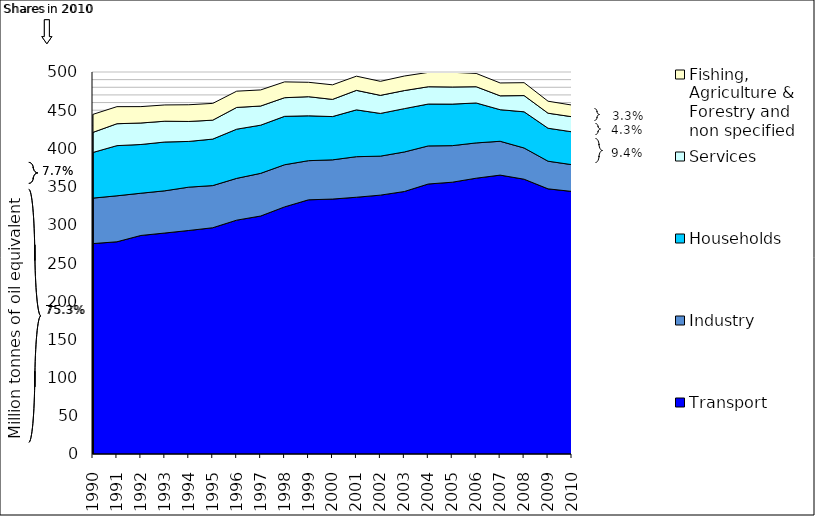
| Category | Transport | Industry | Households | Services | Fishing, Agriculture & Forestry and non specified |
|---|---|---|---|---|---|
| 1990 | 275.433 | 59.505 | 59.767 | 26.307 | 23.562 |
| 1991 | 277.766 | 60.18 | 65.666 | 28.686 | 22.345 |
| 1992 | 286.045 | 55.274 | 63.794 | 28.149 | 21.427 |
| 1993 | 289.242 | 55.252 | 63.865 | 27.23 | 21.281 |
| 1994 | 292.565 | 56.713 | 59.848 | 26.132 | 21.871 |
| 1995 | 296.14 | 55.193 | 60.851 | 24.77 | 21.971 |
| 1996 | 306.094 | 54.68 | 64.374 | 28.486 | 21.257 |
| 1997 | 311.492 | 55.841 | 63.069 | 25.069 | 21.061 |
| 1998 | 323.449 | 55.166 | 63.355 | 24.399 | 20.688 |
| 1999 | 332.713 | 51.225 | 58.703 | 25.032 | 18.866 |
| 2000 | 333.671 | 51.337 | 56.65 | 22.49 | 19.062 |
| 2001 | 336.063 | 53.098 | 61.265 | 25.528 | 18.585 |
| 2002 | 338.831 | 51.034 | 55.914 | 23.635 | 18.363 |
| 2003 | 343.569 | 51.753 | 56.72 | 23.647 | 19.046 |
| 2004 | 353.406 | 49.844 | 54.818 | 22.644 | 18.789 |
| 2005 | 355.745 | 47.864 | 54.363 | 22.388 | 19.278 |
| 2006 | 361.004 | 46.181 | 52.271 | 21.266 | 17.405 |
| 2007 | 365.033 | 44.293 | 41.329 | 18.162 | 16.834 |
| 2008 | 359.662 | 40.881 | 47.363 | 21.231 | 16.875 |
| 2009 | 347.056 | 36.196 | 43.161 | 19.673 | 15.683 |
| 2010 | 343.661 | 35.018 | 43.015 | 19.732 | 15.241 |